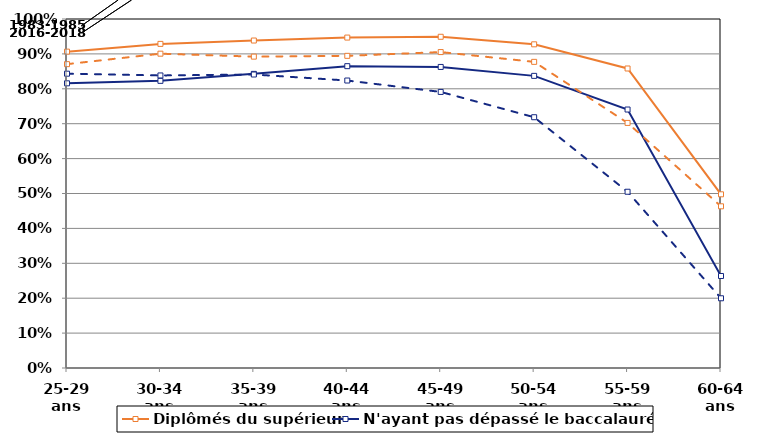
| Category | Diplômés du supérieur | N'ayant pas dépassé le baccalauréat* | Series 3 | Series 4 |
|---|---|---|---|---|
| 25-29 ans | 0.906 | 0.816 | 0.843 | 0.871 |
| 30-34 ans | 0.929 | 0.823 | 0.838 | 0.901 |
| 35-39 ans | 0.938 | 0.843 | 0.841 | 0.892 |
| 40-44 ans | 0.947 | 0.865 | 0.824 | 0.894 |
| 45-49 ans | 0.949 | 0.863 | 0.791 | 0.905 |
| 50-54 ans | 0.927 | 0.837 | 0.719 | 0.877 |
| 55-59 ans | 0.858 | 0.741 | 0.505 | 0.702 |
| 60-64 ans | 0.498 | 0.264 | 0.2 | 0.463 |